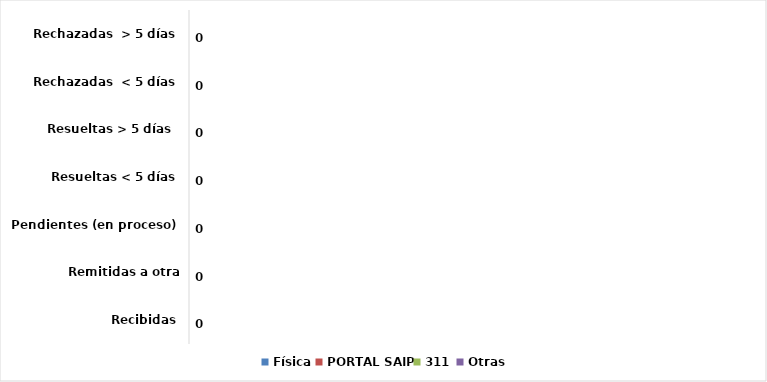
| Category | Física | PORTAL SAIP | 311 | Otras |
|---|---|---|---|---|
| Recibidas | 0 | 0 | 0 | 0 |
| Remitidas a otra institución | 0 | 0 | 0 | 0 |
| Pendientes (en proceso) | 0 | 0 | 0 | 0 |
| Resueltas < 5 días | 0 | 0 | 0 | 0 |
| Resueltas > 5 días  | 0 | 0 | 0 | 0 |
| Rechazadas  < 5 días | 0 | 0 | 0 | 0 |
| Rechazadas  > 5 días | 0 | 0 | 0 | 0 |